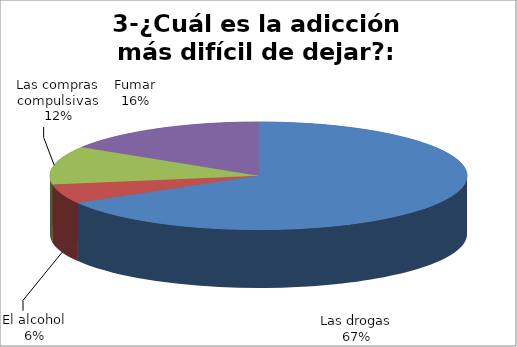
| Category | Series 0 |
|---|---|
| Las drogas | 220 |
| El alcohol | 19 |
| Las compras compulsivas | 38 |
| Fumar | 53 |